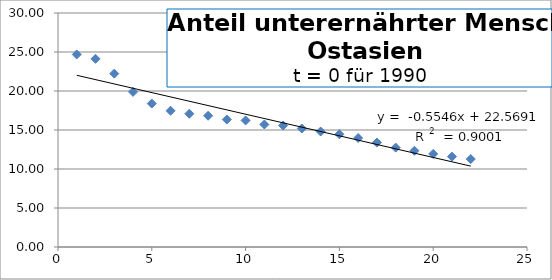
| Category | Series 0 |
|---|---|
| 1.0 | 24.683 |
| 2.0 | 24.126 |
| 3.0 | 22.227 |
| 4.0 | 19.888 |
| 5.0 | 18.39 |
| 6.0 | 17.47 |
| 7.0 | 17.083 |
| 8.0 | 16.828 |
| 9.0 | 16.341 |
| 10.0 | 16.227 |
| 11.0 | 15.707 |
| 12.0 | 15.576 |
| 13.0 | 15.19 |
| 14.0 | 14.805 |
| 15.0 | 14.451 |
| 16.0 | 13.973 |
| 17.0 | 13.39 |
| 18.0 | 12.74 |
| 19.0 | 12.336 |
| 20.0 | 11.932 |
| 21.0 | 11.581 |
| 22.0 | 11.275 |